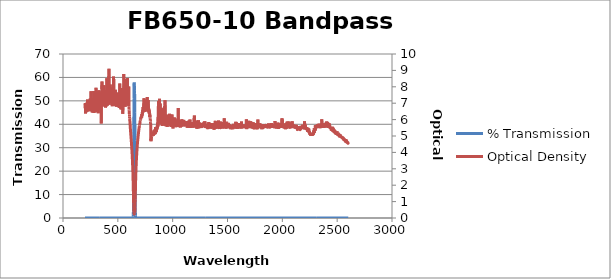
| Category | % Transmission |
|---|---|
| 2600.0 | 0.003 |
| 2599.0 | 0.003 |
| 2598.0 | 0.003 |
| 2597.0 | 0.003 |
| 2596.0 | 0.002 |
| 2595.0 | 0.002 |
| 2594.0 | 0.002 |
| 2593.0 | 0.002 |
| 2592.0 | 0.003 |
| 2591.0 | 0.002 |
| 2590.0 | 0.002 |
| 2589.0 | 0.002 |
| 2588.0 | 0.003 |
| 2587.0 | 0.002 |
| 2586.0 | 0.002 |
| 2585.0 | 0.002 |
| 2584.0 | 0.002 |
| 2583.0 | 0.003 |
| 2582.0 | 0.002 |
| 2581.0 | 0.002 |
| 2580.0 | 0.002 |
| 2579.0 | 0.002 |
| 2578.0 | 0.002 |
| 2577.0 | 0.002 |
| 2576.0 | 0.002 |
| 2575.0 | 0.002 |
| 2574.0 | 0.002 |
| 2573.0 | 0.002 |
| 2572.0 | 0.002 |
| 2571.0 | 0.002 |
| 2570.0 | 0.002 |
| 2569.0 | 0.002 |
| 2568.0 | 0.002 |
| 2567.0 | 0.001 |
| 2566.0 | 0.002 |
| 2565.0 | 0.002 |
| 2564.0 | 0.001 |
| 2563.0 | 0.002 |
| 2562.0 | 0.001 |
| 2561.0 | 0.001 |
| 2560.0 | 0.001 |
| 2559.0 | 0.001 |
| 2558.0 | 0.001 |
| 2557.0 | 0.001 |
| 2556.0 | 0.001 |
| 2555.0 | 0.001 |
| 2554.0 | 0.002 |
| 2553.0 | 0.001 |
| 2552.0 | 0.001 |
| 2551.0 | 0.001 |
| 2550.0 | 0.002 |
| 2549.0 | 0.001 |
| 2548.0 | 0.001 |
| 2547.0 | 0.001 |
| 2546.0 | 0.001 |
| 2545.0 | 0.001 |
| 2544.0 | 0.001 |
| 2543.0 | 0.001 |
| 2542.0 | 0.001 |
| 2541.0 | 0.001 |
| 2540.0 | 0.001 |
| 2539.0 | 0.001 |
| 2538.0 | 0.001 |
| 2537.0 | 0.001 |
| 2536.0 | 0.001 |
| 2535.0 | 0.001 |
| 2534.0 | 0.001 |
| 2533.0 | 0.001 |
| 2532.0 | 0.001 |
| 2531.0 | 0.001 |
| 2530.0 | 0.001 |
| 2529.0 | 0.001 |
| 2528.0 | 0.001 |
| 2527.0 | 0.001 |
| 2526.0 | 0.001 |
| 2525.0 | 0.001 |
| 2524.0 | 0.001 |
| 2523.0 | 0.001 |
| 2522.0 | 0.001 |
| 2521.0 | 0.001 |
| 2520.0 | 0.001 |
| 2519.0 | 0.001 |
| 2518.0 | 0.001 |
| 2517.0 | 0.001 |
| 2516.0 | 0.001 |
| 2515.0 | 0.001 |
| 2514.0 | 0.001 |
| 2513.0 | 0.001 |
| 2512.0 | 0.001 |
| 2511.0 | 0.001 |
| 2510.0 | 0.001 |
| 2509.0 | 0.001 |
| 2508.0 | 0.001 |
| 2507.0 | 0.001 |
| 2506.0 | 0.001 |
| 2505.0 | 0.001 |
| 2504.0 | 0.001 |
| 2503.0 | 0.001 |
| 2502.0 | 0.001 |
| 2501.0 | 0.001 |
| 2500.0 | 0.001 |
| 2499.0 | 0.001 |
| 2498.0 | 0.001 |
| 2497.0 | 0.001 |
| 2496.0 | 0.001 |
| 2495.0 | 0.001 |
| 2494.0 | 0.001 |
| 2493.0 | 0.001 |
| 2492.0 | 0.001 |
| 2491.0 | 0.001 |
| 2490.0 | 0.001 |
| 2489.0 | 0.001 |
| 2488.0 | 0.001 |
| 2487.0 | 0.001 |
| 2486.0 | 0.001 |
| 2485.0 | 0.001 |
| 2484.0 | 0.001 |
| 2483.0 | 0.001 |
| 2482.0 | 0.001 |
| 2481.0 | 0 |
| 2480.0 | 0.001 |
| 2479.0 | 0.001 |
| 2478.0 | 0.001 |
| 2477.0 | 0 |
| 2476.0 | 0 |
| 2475.0 | 0.001 |
| 2474.0 | 0 |
| 2473.0 | 0.001 |
| 2472.0 | 0 |
| 2471.0 | 0.001 |
| 2470.0 | 0.001 |
| 2469.0 | 0 |
| 2468.0 | 0 |
| 2467.0 | 0 |
| 2466.0 | 0.001 |
| 2465.0 | 0 |
| 2464.0 | 0 |
| 2463.0 | 0 |
| 2462.0 | 0 |
| 2461.0 | 0 |
| 2460.0 | 0 |
| 2459.0 | 0.001 |
| 2458.0 | 0 |
| 2457.0 | 0 |
| 2456.0 | 0 |
| 2455.0 | 0 |
| 2454.0 | 0 |
| 2453.0 | 0 |
| 2452.0 | 0 |
| 2451.0 | 0 |
| 2450.0 | 0 |
| 2449.0 | 0 |
| 2448.0 | 0 |
| 2447.0 | 0 |
| 2446.0 | 0 |
| 2445.0 | 0 |
| 2444.0 | 0 |
| 2443.0 | 0 |
| 2442.0 | 0 |
| 2441.0 | 0 |
| 2440.0 | 0 |
| 2439.0 | 0 |
| 2438.0 | 0 |
| 2437.0 | 0 |
| 2436.0 | 0 |
| 2435.0 | 0 |
| 2434.0 | 0 |
| 2433.0 | 0 |
| 2432.0 | 0 |
| 2431.0 | 0 |
| 2430.0 | 0 |
| 2429.0 | 0 |
| 2428.0 | 0 |
| 2427.0 | 0 |
| 2426.0 | 0 |
| 2425.0 | 0 |
| 2424.0 | 0 |
| 2423.0 | 0 |
| 2422.0 | 0 |
| 2421.0 | 0 |
| 2420.0 | 0 |
| 2419.0 | 0 |
| 2418.0 | 0 |
| 2417.0 | 0 |
| 2416.0 | 0 |
| 2415.0 | 0 |
| 2414.0 | 0 |
| 2413.0 | 0 |
| 2412.0 | 0 |
| 2411.0 | 0 |
| 2410.0 | 0 |
| 2409.0 | 0 |
| 2408.0 | 0 |
| 2407.0 | 0 |
| 2406.0 | 0 |
| 2405.0 | 0 |
| 2404.0 | 0 |
| 2403.0 | 0 |
| 2402.0 | 0 |
| 2401.0 | 0 |
| 2400.0 | 0 |
| 2399.0 | 0 |
| 2398.0 | 0 |
| 2397.0 | 0 |
| 2396.0 | 0 |
| 2395.0 | 0 |
| 2394.0 | 0 |
| 2393.0 | 0 |
| 2392.0 | 0 |
| 2391.0 | 0 |
| 2390.0 | 0 |
| 2389.0 | 0 |
| 2388.0 | 0 |
| 2387.0 | 0 |
| 2386.0 | 0 |
| 2385.0 | 0 |
| 2384.0 | 0 |
| 2383.0 | 0 |
| 2382.0 | 0 |
| 2381.0 | 0 |
| 2380.0 | 0 |
| 2379.0 | 0 |
| 2378.0 | 0 |
| 2377.0 | 0 |
| 2376.0 | 0 |
| 2375.0 | 0 |
| 2374.0 | 0 |
| 2373.0 | 0 |
| 2372.0 | 0 |
| 2371.0 | 0 |
| 2370.0 | 0 |
| 2369.0 | 0 |
| 2368.0 | 0 |
| 2367.0 | 0 |
| 2366.0 | 0 |
| 2365.0 | 0 |
| 2364.0 | 0 |
| 2363.0 | 0 |
| 2362.0 | 0 |
| 2361.0 | 0 |
| 2360.0 | 0 |
| 2359.0 | 0 |
| 2358.0 | 0 |
| 2357.0 | 0 |
| 2356.0 | 0 |
| 2355.0 | 0 |
| 2354.0 | 0 |
| 2353.0 | 0 |
| 2352.0 | 0 |
| 2351.0 | 0 |
| 2350.0 | 0 |
| 2349.0 | 0 |
| 2348.0 | 0 |
| 2347.0 | 0 |
| 2346.0 | 0 |
| 2345.0 | 0 |
| 2344.0 | 0 |
| 2343.0 | 0 |
| 2342.0 | 0 |
| 2341.0 | 0 |
| 2340.0 | 0 |
| 2339.0 | 0 |
| 2338.0 | 0 |
| 2337.0 | 0 |
| 2336.0 | 0 |
| 2335.0 | 0 |
| 2334.0 | 0 |
| 2333.0 | 0 |
| 2332.0 | 0 |
| 2331.0 | 0 |
| 2330.0 | 0 |
| 2329.0 | 0 |
| 2328.0 | 0 |
| 2327.0 | 0 |
| 2326.0 | 0 |
| 2325.0 | 0 |
| 2324.0 | 0 |
| 2323.0 | 0 |
| 2322.0 | 0 |
| 2321.0 | 0 |
| 2320.0 | 0 |
| 2319.0 | 0 |
| 2318.0 | 0 |
| 2317.0 | 0 |
| 2316.0 | 0 |
| 2315.0 | 0 |
| 2314.0 | 0 |
| 2313.0 | 0 |
| 2312.0 | 0 |
| 2311.0 | 0 |
| 2310.0 | 0 |
| 2309.0 | 0 |
| 2308.0 | 0 |
| 2307.0 | 0 |
| 2306.0 | 0 |
| 2305.0 | 0 |
| 2304.0 | 0 |
| 2303.0 | 0 |
| 2302.0 | 0 |
| 2301.0 | 0 |
| 2300.0 | 0 |
| 2299.0 | 0 |
| 2298.0 | 0 |
| 2297.0 | 0 |
| 2296.0 | 0 |
| 2295.0 | 0 |
| 2294.0 | 0 |
| 2293.0 | 0 |
| 2292.0 | 0 |
| 2291.0 | 0.001 |
| 2290.0 | 0.001 |
| 2289.0 | 0 |
| 2288.0 | 0.001 |
| 2287.0 | 0.001 |
| 2286.0 | 0 |
| 2285.0 | 0.001 |
| 2284.0 | 0.001 |
| 2283.0 | 0.001 |
| 2282.0 | 0.001 |
| 2281.0 | 0.001 |
| 2280.0 | 0.001 |
| 2279.0 | 0.001 |
| 2278.0 | 0.001 |
| 2277.0 | 0.001 |
| 2276.0 | 0.001 |
| 2275.0 | 0.001 |
| 2274.0 | 0.001 |
| 2273.0 | 0.001 |
| 2272.0 | 0.001 |
| 2271.0 | 0.001 |
| 2270.0 | 0.001 |
| 2269.0 | 0.001 |
| 2268.0 | 0.001 |
| 2267.0 | 0.001 |
| 2266.0 | 0.001 |
| 2265.0 | 0.001 |
| 2264.0 | 0.001 |
| 2263.0 | 0.001 |
| 2262.0 | 0.001 |
| 2261.0 | 0.001 |
| 2260.0 | 0.001 |
| 2259.0 | 0.001 |
| 2258.0 | 0.001 |
| 2257.0 | 0.001 |
| 2256.0 | 0.001 |
| 2255.0 | 0.001 |
| 2254.0 | 0.001 |
| 2253.0 | 0.001 |
| 2252.0 | 0.001 |
| 2251.0 | 0.001 |
| 2250.0 | 0.001 |
| 2249.0 | 0.001 |
| 2248.0 | 0.001 |
| 2247.0 | 0.001 |
| 2246.0 | 0.001 |
| 2245.0 | 0.001 |
| 2244.0 | 0.001 |
| 2243.0 | 0.001 |
| 2242.0 | 0 |
| 2241.0 | 0 |
| 2240.0 | 0.001 |
| 2239.0 | 0 |
| 2238.0 | 0.001 |
| 2237.0 | 0.001 |
| 2236.0 | 0 |
| 2235.0 | 0 |
| 2234.0 | 0 |
| 2233.0 | 0 |
| 2232.0 | 0 |
| 2231.0 | 0.001 |
| 2230.0 | 0 |
| 2229.0 | 0 |
| 2228.0 | 0 |
| 2227.0 | 0 |
| 2226.0 | 0 |
| 2225.0 | 0 |
| 2224.0 | 0 |
| 2223.0 | 0 |
| 2222.0 | 0 |
| 2221.0 | 0 |
| 2220.0 | 0 |
| 2219.0 | 0 |
| 2218.0 | 0 |
| 2217.0 | 0 |
| 2216.0 | 0 |
| 2215.0 | 0 |
| 2214.0 | 0 |
| 2213.0 | 0 |
| 2212.0 | 0 |
| 2211.0 | 0 |
| 2210.0 | 0 |
| 2209.0 | 0 |
| 2208.0 | 0 |
| 2207.0 | 0 |
| 2206.0 | 0 |
| 2205.0 | 0 |
| 2204.0 | 0 |
| 2203.0 | 0 |
| 2202.0 | 0 |
| 2201.0 | 0 |
| 2200.0 | 0 |
| 2199.0 | 0 |
| 2198.0 | 0 |
| 2197.0 | 0 |
| 2196.0 | 0 |
| 2195.0 | 0 |
| 2194.0 | 0 |
| 2193.0 | 0 |
| 2192.0 | 0 |
| 2191.0 | 0 |
| 2190.0 | 0 |
| 2189.0 | 0 |
| 2188.0 | 0 |
| 2187.0 | 0 |
| 2186.0 | 0 |
| 2185.0 | 0 |
| 2184.0 | 0 |
| 2183.0 | 0 |
| 2182.0 | 0 |
| 2181.0 | 0 |
| 2180.0 | 0 |
| 2179.0 | 0 |
| 2178.0 | 0 |
| 2177.0 | 0 |
| 2176.0 | 0 |
| 2175.0 | 0 |
| 2174.0 | 0 |
| 2173.0 | 0 |
| 2172.0 | 0 |
| 2171.0 | 0 |
| 2170.0 | 0 |
| 2169.0 | 0 |
| 2168.0 | 0 |
| 2167.0 | 0 |
| 2166.0 | 0 |
| 2165.0 | 0 |
| 2164.0 | 0 |
| 2163.0 | 0 |
| 2162.0 | 0 |
| 2161.0 | 0 |
| 2160.0 | 0 |
| 2159.0 | 0 |
| 2158.0 | 0 |
| 2157.0 | 0 |
| 2156.0 | 0 |
| 2155.0 | 0 |
| 2154.0 | 0 |
| 2153.0 | 0 |
| 2152.0 | 0 |
| 2151.0 | 0 |
| 2150.0 | 0 |
| 2149.0 | 0 |
| 2148.0 | 0 |
| 2147.0 | 0 |
| 2146.0 | 0 |
| 2145.0 | 0 |
| 2144.0 | 0 |
| 2143.0 | 0 |
| 2142.0 | 0 |
| 2141.0 | 0 |
| 2140.0 | 0 |
| 2139.0 | 0 |
| 2138.0 | 0 |
| 2137.0 | 0 |
| 2136.0 | 0 |
| 2135.0 | 0 |
| 2134.0 | 0 |
| 2133.0 | 0 |
| 2132.0 | 0 |
| 2131.0 | 0 |
| 2130.0 | 0 |
| 2129.0 | 0 |
| 2128.0 | 0 |
| 2127.0 | 0 |
| 2126.0 | 0 |
| 2125.0 | 0 |
| 2124.0 | 0 |
| 2123.0 | 0 |
| 2122.0 | 0 |
| 2121.0 | 0 |
| 2120.0 | 0 |
| 2119.0 | 0 |
| 2118.0 | 0 |
| 2117.0 | 0 |
| 2116.0 | 0 |
| 2115.0 | 0 |
| 2114.0 | 0 |
| 2113.0 | 0 |
| 2112.0 | 0 |
| 2111.0 | 0 |
| 2110.0 | 0 |
| 2109.0 | 0 |
| 2108.0 | 0 |
| 2107.0 | 0 |
| 2106.0 | 0 |
| 2105.0 | 0 |
| 2104.0 | 0 |
| 2103.0 | 0 |
| 2102.0 | 0 |
| 2101.0 | 0 |
| 2100.0 | 0 |
| 2099.0 | 0 |
| 2098.0 | 0 |
| 2097.0 | 0 |
| 2096.0 | 0 |
| 2095.0 | 0 |
| 2094.0 | 0 |
| 2093.0 | 0 |
| 2092.0 | 0 |
| 2091.0 | 0 |
| 2090.0 | 0 |
| 2089.0 | 0 |
| 2088.0 | 0 |
| 2087.0 | 0 |
| 2086.0 | 0 |
| 2085.0 | 0 |
| 2084.0 | 0 |
| 2083.0 | 0 |
| 2082.0 | 0 |
| 2081.0 | 0 |
| 2080.0 | 0 |
| 2079.0 | 0 |
| 2078.0 | 0 |
| 2077.0 | 0 |
| 2076.0 | 0 |
| 2075.0 | 0 |
| 2074.0 | 0 |
| 2073.0 | 0 |
| 2072.0 | 0 |
| 2071.0 | 0 |
| 2070.0 | 0 |
| 2069.0 | 0 |
| 2068.0 | 0 |
| 2067.0 | 0 |
| 2066.0 | 0 |
| 2065.0 | 0 |
| 2064.0 | 0 |
| 2063.0 | 0 |
| 2062.0 | 0 |
| 2061.0 | 0 |
| 2060.0 | 0 |
| 2059.0 | 0 |
| 2058.0 | 0 |
| 2057.0 | 0 |
| 2056.0 | 0 |
| 2055.0 | 0 |
| 2054.0 | 0 |
| 2053.0 | 0 |
| 2052.0 | 0 |
| 2051.0 | 0 |
| 2050.0 | 0 |
| 2049.0 | 0 |
| 2048.0 | 0 |
| 2047.0 | 0 |
| 2046.0 | 0 |
| 2045.0 | 0 |
| 2044.0 | 0 |
| 2043.0 | 0 |
| 2042.0 | 0 |
| 2041.0 | 0 |
| 2040.0 | 0 |
| 2039.0 | 0 |
| 2038.0 | 0 |
| 2037.0 | 0 |
| 2036.0 | 0 |
| 2035.0 | 0 |
| 2034.0 | 0 |
| 2033.0 | 0 |
| 2032.0 | 0 |
| 2031.0 | 0 |
| 2030.0 | 0 |
| 2029.0 | 0 |
| 2028.0 | 0 |
| 2027.0 | 0 |
| 2026.0 | 0 |
| 2025.0 | 0 |
| 2024.0 | 0 |
| 2023.0 | 0 |
| 2022.0 | 0 |
| 2021.0 | 0 |
| 2020.0 | 0 |
| 2019.0 | 0 |
| 2018.0 | 0 |
| 2017.0 | 0 |
| 2016.0 | 0 |
| 2015.0 | 0 |
| 2014.0 | 0 |
| 2013.0 | 0 |
| 2012.0 | 0 |
| 2011.0 | 0 |
| 2010.0 | 0 |
| 2009.0 | 0 |
| 2008.0 | 0 |
| 2007.0 | 0 |
| 2006.0 | 0 |
| 2005.0 | 0 |
| 2004.0 | 0 |
| 2003.0 | 0 |
| 2002.0 | 0 |
| 2001.0 | 0 |
| 2000.0 | 0 |
| 1999.0 | 0 |
| 1998.0 | 0 |
| 1997.0 | 0 |
| 1996.0 | 0 |
| 1995.0 | 0 |
| 1994.0 | 0 |
| 1993.0 | 0 |
| 1992.0 | 0 |
| 1991.0 | 0 |
| 1990.0 | 0 |
| 1989.0 | 0 |
| 1988.0 | 0 |
| 1987.0 | 0 |
| 1986.0 | 0 |
| 1985.0 | 0 |
| 1984.0 | 0 |
| 1983.0 | 0 |
| 1982.0 | 0 |
| 1981.0 | 0 |
| 1980.0 | 0 |
| 1979.0 | 0 |
| 1978.0 | 0 |
| 1977.0 | 0 |
| 1976.0 | 0 |
| 1975.0 | 0 |
| 1974.0 | 0 |
| 1973.0 | 0 |
| 1972.0 | 0 |
| 1971.0 | 0 |
| 1970.0 | 0 |
| 1969.0 | 0 |
| 1968.0 | 0 |
| 1967.0 | 0 |
| 1966.0 | 0 |
| 1965.0 | 0 |
| 1964.0 | 0 |
| 1963.0 | 0 |
| 1962.0 | 0 |
| 1961.0 | 0 |
| 1960.0 | 0 |
| 1959.0 | 0 |
| 1958.0 | 0 |
| 1957.0 | 0 |
| 1956.0 | 0 |
| 1955.0 | 0 |
| 1954.0 | 0 |
| 1953.0 | 0 |
| 1952.0 | 0 |
| 1951.0 | 0 |
| 1950.0 | 0 |
| 1949.0 | 0 |
| 1948.0 | 0 |
| 1947.0 | 0 |
| 1946.0 | 0 |
| 1945.0 | 0 |
| 1944.0 | 0 |
| 1943.0 | 0 |
| 1942.0 | 0 |
| 1941.0 | 0 |
| 1940.0 | 0 |
| 1939.0 | 0 |
| 1938.0 | 0 |
| 1937.0 | 0 |
| 1936.0 | 0 |
| 1935.0 | 0 |
| 1934.0 | 0 |
| 1933.0 | 0 |
| 1932.0 | 0 |
| 1931.0 | 0 |
| 1930.0 | 0 |
| 1929.0 | 0 |
| 1928.0 | 0 |
| 1927.0 | 0 |
| 1926.0 | 0 |
| 1925.0 | 0 |
| 1924.0 | 0 |
| 1923.0 | 0 |
| 1922.0 | 0 |
| 1921.0 | 0 |
| 1920.0 | 0 |
| 1919.0 | 0 |
| 1918.0 | 0 |
| 1917.0 | 0 |
| 1916.0 | 0 |
| 1915.0 | 0 |
| 1914.0 | 0 |
| 1913.0 | 0 |
| 1912.0 | 0 |
| 1911.0 | 0 |
| 1910.0 | 0 |
| 1909.0 | 0 |
| 1908.0 | 0 |
| 1907.0 | 0 |
| 1906.0 | 0 |
| 1905.0 | 0 |
| 1904.0 | 0 |
| 1903.0 | 0 |
| 1902.0 | 0 |
| 1901.0 | 0 |
| 1900.0 | 0 |
| 1899.0 | 0 |
| 1898.0 | 0 |
| 1897.0 | 0 |
| 1896.0 | 0 |
| 1895.0 | 0 |
| 1894.0 | 0 |
| 1893.0 | 0 |
| 1892.0 | 0 |
| 1891.0 | 0 |
| 1890.0 | 0 |
| 1889.0 | 0 |
| 1888.0 | 0 |
| 1887.0 | 0 |
| 1886.0 | 0 |
| 1885.0 | 0 |
| 1884.0 | 0 |
| 1883.0 | 0 |
| 1882.0 | 0 |
| 1881.0 | 0 |
| 1880.0 | 0 |
| 1879.0 | 0 |
| 1878.0 | 0 |
| 1877.0 | 0 |
| 1876.0 | 0 |
| 1875.0 | 0 |
| 1874.0 | 0 |
| 1873.0 | 0 |
| 1872.0 | 0 |
| 1871.0 | 0 |
| 1870.0 | 0 |
| 1869.0 | 0 |
| 1868.0 | 0 |
| 1867.0 | 0 |
| 1866.0 | 0 |
| 1865.0 | 0 |
| 1864.0 | 0 |
| 1863.0 | 0 |
| 1862.0 | 0 |
| 1861.0 | 0 |
| 1860.0 | 0 |
| 1859.0 | 0 |
| 1858.0 | 0 |
| 1857.0 | 0 |
| 1856.0 | 0 |
| 1855.0 | 0 |
| 1854.0 | 0 |
| 1853.0 | 0 |
| 1852.0 | 0 |
| 1851.0 | 0 |
| 1850.0 | 0 |
| 1849.0 | 0 |
| 1848.0 | 0 |
| 1847.0 | 0 |
| 1846.0 | 0 |
| 1845.0 | 0 |
| 1844.0 | 0 |
| 1843.0 | 0 |
| 1842.0 | 0 |
| 1841.0 | 0 |
| 1840.0 | 0 |
| 1839.0 | 0 |
| 1838.0 | 0 |
| 1837.0 | 0 |
| 1836.0 | 0 |
| 1835.0 | 0 |
| 1834.0 | 0 |
| 1833.0 | 0 |
| 1832.0 | 0 |
| 1831.0 | 0 |
| 1830.0 | 0 |
| 1829.0 | 0 |
| 1828.0 | 0 |
| 1827.0 | 0 |
| 1826.0 | 0 |
| 1825.0 | 0 |
| 1824.0 | 0 |
| 1823.0 | 0 |
| 1822.0 | 0 |
| 1821.0 | 0 |
| 1820.0 | 0 |
| 1819.0 | 0 |
| 1818.0 | 0 |
| 1817.0 | 0 |
| 1816.0 | 0 |
| 1815.0 | 0 |
| 1814.0 | 0 |
| 1813.0 | 0 |
| 1812.0 | 0 |
| 1811.0 | 0 |
| 1810.0 | 0 |
| 1809.0 | 0 |
| 1808.0 | 0 |
| 1807.0 | 0 |
| 1806.0 | 0 |
| 1805.0 | 0 |
| 1804.0 | 0 |
| 1803.0 | 0 |
| 1802.0 | 0 |
| 1801.0 | 0 |
| 1800.0 | 0 |
| 1799.0 | 0 |
| 1798.0 | 0 |
| 1797.0 | 0 |
| 1796.0 | 0 |
| 1795.0 | 0 |
| 1794.0 | 0 |
| 1793.0 | 0 |
| 1792.0 | 0 |
| 1791.0 | 0 |
| 1790.0 | 0 |
| 1789.0 | 0 |
| 1788.0 | 0 |
| 1787.0 | 0 |
| 1786.0 | 0 |
| 1785.0 | 0 |
| 1784.0 | 0 |
| 1783.0 | 0 |
| 1782.0 | 0 |
| 1781.0 | 0 |
| 1780.0 | 0 |
| 1779.0 | 0 |
| 1778.0 | 0 |
| 1777.0 | 0 |
| 1776.0 | 0 |
| 1775.0 | 0 |
| 1774.0 | 0 |
| 1773.0 | 0 |
| 1772.0 | 0 |
| 1771.0 | 0 |
| 1770.0 | 0 |
| 1769.0 | 0 |
| 1768.0 | 0 |
| 1767.0 | 0 |
| 1766.0 | 0 |
| 1765.0 | 0 |
| 1764.0 | 0 |
| 1763.0 | 0 |
| 1762.0 | 0 |
| 1761.0 | 0 |
| 1760.0 | 0 |
| 1759.0 | 0 |
| 1758.0 | 0 |
| 1757.0 | 0 |
| 1756.0 | 0 |
| 1755.0 | 0 |
| 1754.0 | 0 |
| 1753.0 | 0 |
| 1752.0 | 0 |
| 1751.0 | 0 |
| 1750.0 | 0 |
| 1749.0 | 0 |
| 1748.0 | 0 |
| 1747.0 | 0 |
| 1746.0 | 0 |
| 1745.0 | 0 |
| 1744.0 | 0 |
| 1743.0 | 0 |
| 1742.0 | 0 |
| 1741.0 | 0 |
| 1740.0 | 0 |
| 1739.0 | 0 |
| 1738.0 | 0 |
| 1737.0 | 0 |
| 1736.0 | 0 |
| 1735.0 | 0 |
| 1734.0 | 0 |
| 1733.0 | 0 |
| 1732.0 | 0 |
| 1731.0 | 0 |
| 1730.0 | 0 |
| 1729.0 | 0 |
| 1728.0 | 0 |
| 1727.0 | 0 |
| 1726.0 | 0 |
| 1725.0 | 0 |
| 1724.0 | 0 |
| 1723.0 | 0 |
| 1722.0 | 0 |
| 1721.0 | 0 |
| 1720.0 | 0 |
| 1719.0 | 0 |
| 1718.0 | 0 |
| 1717.0 | 0 |
| 1716.0 | 0 |
| 1715.0 | 0 |
| 1714.0 | 0 |
| 1713.0 | 0 |
| 1712.0 | 0 |
| 1711.0 | 0 |
| 1710.0 | 0 |
| 1709.0 | 0 |
| 1708.0 | 0 |
| 1707.0 | 0 |
| 1706.0 | 0 |
| 1705.0 | 0 |
| 1704.0 | 0 |
| 1703.0 | 0 |
| 1702.0 | 0 |
| 1701.0 | 0 |
| 1700.0 | 0 |
| 1699.0 | 0 |
| 1698.0 | 0 |
| 1697.0 | 0 |
| 1696.0 | 0 |
| 1695.0 | 0 |
| 1694.0 | 0 |
| 1693.0 | 0 |
| 1692.0 | 0 |
| 1691.0 | 0 |
| 1690.0 | 0 |
| 1689.0 | 0 |
| 1688.0 | 0 |
| 1687.0 | 0 |
| 1686.0 | 0 |
| 1685.0 | 0 |
| 1684.0 | 0 |
| 1683.0 | 0 |
| 1682.0 | 0 |
| 1681.0 | 0 |
| 1680.0 | 0 |
| 1679.0 | 0 |
| 1678.0 | 0 |
| 1677.0 | 0 |
| 1676.0 | 0 |
| 1675.0 | 0 |
| 1674.0 | 0 |
| 1673.0 | 0 |
| 1672.0 | 0 |
| 1671.0 | 0 |
| 1670.0 | 0 |
| 1669.0 | 0 |
| 1668.0 | 0 |
| 1667.0 | 0 |
| 1666.0 | 0 |
| 1665.0 | 0 |
| 1664.0 | 0 |
| 1663.0 | 0 |
| 1662.0 | 0 |
| 1661.0 | 0 |
| 1660.0 | 0 |
| 1659.0 | 0 |
| 1658.0 | 0 |
| 1657.0 | 0 |
| 1656.0 | 0 |
| 1655.0 | 0 |
| 1654.0 | 0 |
| 1653.0 | 0 |
| 1652.0 | 0 |
| 1651.0 | 0 |
| 1650.0 | 0 |
| 1649.0 | 0 |
| 1648.0 | 0 |
| 1647.0 | 0 |
| 1646.0 | 0 |
| 1645.0 | 0 |
| 1644.0 | 0 |
| 1643.0 | 0 |
| 1642.0 | 0 |
| 1641.0 | 0 |
| 1640.0 | 0 |
| 1639.0 | 0 |
| 1638.0 | 0 |
| 1637.0 | 0 |
| 1636.0 | 0 |
| 1635.0 | 0 |
| 1634.0 | 0 |
| 1633.0 | 0 |
| 1632.0 | 0 |
| 1631.0 | 0 |
| 1630.0 | 0 |
| 1629.0 | 0 |
| 1628.0 | 0 |
| 1627.0 | 0 |
| 1626.0 | 0 |
| 1625.0 | 0 |
| 1624.0 | 0 |
| 1623.0 | 0 |
| 1622.0 | 0 |
| 1621.0 | 0 |
| 1620.0 | 0 |
| 1619.0 | 0 |
| 1618.0 | 0 |
| 1617.0 | 0 |
| 1616.0 | 0 |
| 1615.0 | 0 |
| 1614.0 | 0 |
| 1613.0 | 0 |
| 1612.0 | 0 |
| 1611.0 | 0 |
| 1610.0 | 0 |
| 1609.0 | 0 |
| 1608.0 | 0 |
| 1607.0 | 0 |
| 1606.0 | 0 |
| 1605.0 | 0 |
| 1604.0 | 0 |
| 1603.0 | 0 |
| 1602.0 | 0 |
| 1601.0 | 0 |
| 1600.0 | 0 |
| 1599.0 | 0 |
| 1598.0 | 0 |
| 1597.0 | 0 |
| 1596.0 | 0 |
| 1595.0 | 0 |
| 1594.0 | 0 |
| 1593.0 | 0 |
| 1592.0 | 0 |
| 1591.0 | 0 |
| 1590.0 | 0 |
| 1589.0 | 0 |
| 1588.0 | 0 |
| 1587.0 | 0 |
| 1586.0 | 0 |
| 1585.0 | 0 |
| 1584.0 | 0 |
| 1583.0 | 0 |
| 1582.0 | 0 |
| 1581.0 | 0 |
| 1580.0 | 0 |
| 1579.0 | 0 |
| 1578.0 | 0 |
| 1577.0 | 0 |
| 1576.0 | 0 |
| 1575.0 | 0 |
| 1574.0 | 0 |
| 1573.0 | 0 |
| 1572.0 | 0 |
| 1571.0 | 0 |
| 1570.0 | 0 |
| 1569.0 | 0 |
| 1568.0 | 0 |
| 1567.0 | 0 |
| 1566.0 | 0 |
| 1565.0 | 0 |
| 1564.0 | 0 |
| 1563.0 | 0 |
| 1562.0 | 0 |
| 1561.0 | 0 |
| 1560.0 | 0 |
| 1559.0 | 0 |
| 1558.0 | 0 |
| 1557.0 | 0 |
| 1556.0 | 0 |
| 1555.0 | 0 |
| 1554.0 | 0 |
| 1553.0 | 0 |
| 1552.0 | 0 |
| 1551.0 | 0 |
| 1550.0 | 0 |
| 1549.0 | 0 |
| 1548.0 | 0 |
| 1547.0 | 0 |
| 1546.0 | 0 |
| 1545.0 | 0 |
| 1544.0 | 0 |
| 1543.0 | 0 |
| 1542.0 | 0 |
| 1541.0 | 0 |
| 1540.0 | 0 |
| 1539.0 | 0 |
| 1538.0 | 0 |
| 1537.0 | 0 |
| 1536.0 | 0 |
| 1535.0 | 0 |
| 1534.0 | 0 |
| 1533.0 | 0 |
| 1532.0 | 0 |
| 1531.0 | 0 |
| 1530.0 | 0 |
| 1529.0 | 0 |
| 1528.0 | 0 |
| 1527.0 | 0 |
| 1526.0 | 0 |
| 1525.0 | 0 |
| 1524.0 | 0 |
| 1523.0 | 0 |
| 1522.0 | 0 |
| 1521.0 | 0 |
| 1520.0 | 0 |
| 1519.0 | 0 |
| 1518.0 | 0 |
| 1517.0 | 0 |
| 1516.0 | 0 |
| 1515.0 | 0 |
| 1514.0 | 0 |
| 1513.0 | 0 |
| 1512.0 | 0 |
| 1511.0 | 0 |
| 1510.0 | 0 |
| 1509.0 | 0 |
| 1508.0 | 0 |
| 1507.0 | 0 |
| 1506.0 | 0 |
| 1505.0 | 0 |
| 1504.0 | 0 |
| 1503.0 | 0 |
| 1502.0 | 0 |
| 1501.0 | 0 |
| 1500.0 | 0 |
| 1499.0 | 0 |
| 1498.0 | 0 |
| 1497.0 | 0 |
| 1496.0 | 0 |
| 1495.0 | 0 |
| 1494.0 | 0 |
| 1493.0 | 0 |
| 1492.0 | 0 |
| 1491.0 | 0 |
| 1490.0 | 0 |
| 1489.0 | 0 |
| 1488.0 | 0 |
| 1487.0 | 0 |
| 1486.0 | 0 |
| 1485.0 | 0 |
| 1484.0 | 0 |
| 1483.0 | 0 |
| 1482.0 | 0 |
| 1481.0 | 0 |
| 1480.0 | 0 |
| 1479.0 | 0 |
| 1478.0 | 0 |
| 1477.0 | 0 |
| 1476.0 | 0 |
| 1475.0 | 0 |
| 1474.0 | 0 |
| 1473.0 | 0 |
| 1472.0 | 0 |
| 1471.0 | 0 |
| 1470.0 | 0 |
| 1469.0 | 0 |
| 1468.0 | 0 |
| 1467.0 | 0 |
| 1466.0 | 0 |
| 1465.0 | 0 |
| 1464.0 | 0 |
| 1463.0 | 0 |
| 1462.0 | 0 |
| 1461.0 | 0 |
| 1460.0 | 0 |
| 1459.0 | 0 |
| 1458.0 | 0 |
| 1457.0 | 0 |
| 1456.0 | 0 |
| 1455.0 | 0 |
| 1454.0 | 0 |
| 1453.0 | 0 |
| 1452.0 | 0 |
| 1451.0 | 0 |
| 1450.0 | 0 |
| 1449.0 | 0 |
| 1448.0 | 0 |
| 1447.0 | 0 |
| 1446.0 | 0 |
| 1445.0 | 0 |
| 1444.0 | 0 |
| 1443.0 | 0 |
| 1442.0 | 0 |
| 1441.0 | 0 |
| 1440.0 | 0 |
| 1439.0 | 0 |
| 1438.0 | 0 |
| 1437.0 | 0 |
| 1436.0 | 0 |
| 1435.0 | 0 |
| 1434.0 | 0 |
| 1433.0 | 0 |
| 1432.0 | 0 |
| 1431.0 | 0 |
| 1430.0 | 0 |
| 1429.0 | 0 |
| 1428.0 | 0 |
| 1427.0 | 0 |
| 1426.0 | 0 |
| 1425.0 | 0 |
| 1424.0 | 0 |
| 1423.0 | 0 |
| 1422.0 | 0 |
| 1421.0 | 0 |
| 1420.0 | 0 |
| 1419.0 | 0 |
| 1418.0 | 0 |
| 1417.0 | 0 |
| 1416.0 | 0 |
| 1415.0 | 0 |
| 1414.0 | 0 |
| 1413.0 | 0 |
| 1412.0 | 0 |
| 1411.0 | 0 |
| 1410.0 | 0 |
| 1409.0 | 0 |
| 1408.0 | 0 |
| 1407.0 | 0 |
| 1406.0 | 0 |
| 1405.0 | 0 |
| 1404.0 | 0 |
| 1403.0 | 0 |
| 1402.0 | 0 |
| 1401.0 | 0 |
| 1400.0 | 0 |
| 1399.0 | 0 |
| 1398.0 | 0 |
| 1397.0 | 0 |
| 1396.0 | 0 |
| 1395.0 | 0 |
| 1394.0 | 0 |
| 1393.0 | 0 |
| 1392.0 | 0 |
| 1391.0 | 0 |
| 1390.0 | 0 |
| 1389.0 | 0 |
| 1388.0 | 0 |
| 1387.0 | 0 |
| 1386.0 | 0 |
| 1385.0 | 0 |
| 1384.0 | 0 |
| 1383.0 | 0 |
| 1382.0 | 0 |
| 1381.0 | 0 |
| 1380.0 | 0 |
| 1379.0 | 0 |
| 1378.0 | 0 |
| 1377.0 | 0 |
| 1376.0 | 0 |
| 1375.0 | 0 |
| 1374.0 | 0 |
| 1373.0 | 0 |
| 1372.0 | 0 |
| 1371.0 | 0 |
| 1370.0 | 0 |
| 1369.0 | 0 |
| 1368.0 | 0 |
| 1367.0 | 0 |
| 1366.0 | 0 |
| 1365.0 | 0 |
| 1364.0 | 0 |
| 1363.0 | 0 |
| 1362.0 | 0 |
| 1361.0 | 0 |
| 1360.0 | 0 |
| 1359.0 | 0 |
| 1358.0 | 0 |
| 1357.0 | 0 |
| 1356.0 | 0 |
| 1355.0 | 0 |
| 1354.0 | 0 |
| 1353.0 | 0 |
| 1352.0 | 0 |
| 1351.0 | 0 |
| 1350.0 | 0 |
| 1349.0 | 0 |
| 1348.0 | 0 |
| 1347.0 | 0 |
| 1346.0 | 0 |
| 1345.0 | 0 |
| 1344.0 | 0 |
| 1343.0 | 0 |
| 1342.0 | 0 |
| 1341.0 | 0 |
| 1340.0 | 0 |
| 1339.0 | 0 |
| 1338.0 | 0 |
| 1337.0 | 0 |
| 1336.0 | 0 |
| 1335.0 | 0 |
| 1334.0 | 0 |
| 1333.0 | 0 |
| 1332.0 | 0 |
| 1331.0 | 0 |
| 1330.0 | 0 |
| 1329.0 | 0 |
| 1328.0 | 0 |
| 1327.0 | 0 |
| 1326.0 | 0 |
| 1325.0 | 0 |
| 1324.0 | 0 |
| 1323.0 | 0 |
| 1322.0 | 0 |
| 1321.0 | 0 |
| 1320.0 | 0 |
| 1319.0 | 0 |
| 1318.0 | 0 |
| 1317.0 | 0 |
| 1316.0 | 0 |
| 1315.0 | 0 |
| 1314.0 | 0 |
| 1313.0 | 0 |
| 1312.0 | 0 |
| 1311.0 | 0 |
| 1310.0 | 0 |
| 1309.0 | 0 |
| 1308.0 | 0 |
| 1307.0 | 0 |
| 1306.0 | 0 |
| 1305.0 | 0 |
| 1304.0 | 0 |
| 1303.0 | 0 |
| 1302.0 | 0 |
| 1301.0 | 0 |
| 1300.0 | 0 |
| 1299.0 | 0 |
| 1298.0 | 0 |
| 1297.0 | 0 |
| 1296.0 | 0 |
| 1295.0 | 0 |
| 1294.0 | 0 |
| 1293.0 | 0 |
| 1292.0 | 0 |
| 1291.0 | 0 |
| 1290.0 | 0 |
| 1289.0 | 0 |
| 1288.0 | 0 |
| 1287.0 | 0 |
| 1286.0 | 0 |
| 1285.0 | 0 |
| 1284.0 | 0 |
| 1283.0 | 0 |
| 1282.0 | 0 |
| 1281.0 | 0 |
| 1280.0 | 0 |
| 1279.0 | 0 |
| 1278.0 | 0 |
| 1277.0 | 0 |
| 1276.0 | 0 |
| 1275.0 | 0 |
| 1274.0 | 0 |
| 1273.0 | 0 |
| 1272.0 | 0 |
| 1271.0 | 0 |
| 1270.0 | 0 |
| 1269.0 | 0 |
| 1268.0 | 0 |
| 1267.0 | 0 |
| 1266.0 | 0 |
| 1265.0 | 0 |
| 1264.0 | 0 |
| 1263.0 | 0 |
| 1262.0 | 0 |
| 1261.0 | 0 |
| 1260.0 | 0 |
| 1259.0 | 0 |
| 1258.0 | 0 |
| 1257.0 | 0 |
| 1256.0 | 0 |
| 1255.0 | 0 |
| 1254.0 | 0 |
| 1253.0 | 0 |
| 1252.0 | 0 |
| 1251.0 | 0 |
| 1250.0 | 0 |
| 1249.0 | 0 |
| 1248.0 | 0 |
| 1247.0 | 0 |
| 1246.0 | 0 |
| 1245.0 | 0 |
| 1244.0 | 0 |
| 1243.0 | 0 |
| 1242.0 | 0 |
| 1241.0 | 0 |
| 1240.0 | 0 |
| 1239.0 | 0 |
| 1238.0 | 0 |
| 1237.0 | 0 |
| 1236.0 | 0 |
| 1235.0 | 0 |
| 1234.0 | 0 |
| 1233.0 | 0 |
| 1232.0 | 0 |
| 1231.0 | 0 |
| 1230.0 | 0 |
| 1229.0 | 0 |
| 1228.0 | 0 |
| 1227.0 | 0 |
| 1226.0 | 0 |
| 1225.0 | 0 |
| 1224.0 | 0 |
| 1223.0 | 0 |
| 1222.0 | 0 |
| 1221.0 | 0 |
| 1220.0 | 0 |
| 1219.0 | 0 |
| 1218.0 | 0 |
| 1217.0 | 0 |
| 1216.0 | 0 |
| 1215.0 | 0 |
| 1214.0 | 0 |
| 1213.0 | 0 |
| 1212.0 | 0 |
| 1211.0 | 0 |
| 1210.0 | 0 |
| 1209.0 | 0 |
| 1208.0 | 0 |
| 1207.0 | 0 |
| 1206.0 | 0 |
| 1205.0 | 0 |
| 1204.0 | 0 |
| 1203.0 | 0 |
| 1202.0 | 0 |
| 1201.0 | 0 |
| 1200.0 | 0 |
| 1199.0 | 0 |
| 1198.0 | 0 |
| 1197.0 | 0 |
| 1196.0 | 0 |
| 1195.0 | 0 |
| 1194.0 | 0 |
| 1193.0 | 0 |
| 1192.0 | 0 |
| 1191.0 | 0 |
| 1190.0 | 0 |
| 1189.0 | 0 |
| 1188.0 | 0 |
| 1187.0 | 0 |
| 1186.0 | 0 |
| 1185.0 | 0 |
| 1184.0 | 0 |
| 1183.0 | 0 |
| 1182.0 | 0 |
| 1181.0 | 0 |
| 1180.0 | 0 |
| 1179.0 | 0 |
| 1178.0 | 0 |
| 1177.0 | 0 |
| 1176.0 | 0 |
| 1175.0 | 0 |
| 1174.0 | 0 |
| 1173.0 | 0 |
| 1172.0 | 0 |
| 1171.0 | 0 |
| 1170.0 | 0 |
| 1169.0 | 0 |
| 1168.0 | 0 |
| 1167.0 | 0 |
| 1166.0 | 0 |
| 1165.0 | 0 |
| 1164.0 | 0 |
| 1163.0 | 0 |
| 1162.0 | 0 |
| 1161.0 | 0 |
| 1160.0 | 0 |
| 1159.0 | 0 |
| 1158.0 | 0 |
| 1157.0 | 0 |
| 1156.0 | 0 |
| 1155.0 | 0 |
| 1154.0 | 0 |
| 1153.0 | 0 |
| 1152.0 | 0 |
| 1151.0 | 0 |
| 1150.0 | 0 |
| 1149.0 | 0 |
| 1148.0 | 0 |
| 1147.0 | 0 |
| 1146.0 | 0 |
| 1145.0 | 0 |
| 1144.0 | 0 |
| 1143.0 | 0 |
| 1142.0 | 0 |
| 1141.0 | 0 |
| 1140.0 | 0 |
| 1139.0 | 0 |
| 1138.0 | 0 |
| 1137.0 | 0 |
| 1136.0 | 0 |
| 1135.0 | 0 |
| 1134.0 | 0 |
| 1133.0 | 0 |
| 1132.0 | 0 |
| 1131.0 | 0 |
| 1130.0 | 0 |
| 1129.0 | 0 |
| 1128.0 | 0 |
| 1127.0 | 0 |
| 1126.0 | 0 |
| 1125.0 | 0 |
| 1124.0 | 0 |
| 1123.0 | 0 |
| 1122.0 | 0 |
| 1121.0 | 0 |
| 1120.0 | 0 |
| 1119.0 | 0 |
| 1118.0 | 0 |
| 1117.0 | 0 |
| 1116.0 | 0 |
| 1115.0 | 0 |
| 1114.0 | 0 |
| 1113.0 | 0 |
| 1112.0 | 0 |
| 1111.0 | 0 |
| 1110.0 | 0 |
| 1109.0 | 0 |
| 1108.0 | 0 |
| 1107.0 | 0 |
| 1106.0 | 0 |
| 1105.0 | 0 |
| 1104.0 | 0 |
| 1103.0 | 0 |
| 1102.0 | 0 |
| 1101.0 | 0 |
| 1100.0 | 0 |
| 1099.0 | 0 |
| 1098.0 | 0 |
| 1097.0 | 0 |
| 1096.0 | 0 |
| 1095.0 | 0 |
| 1094.0 | 0 |
| 1093.0 | 0 |
| 1092.0 | 0 |
| 1091.0 | 0 |
| 1090.0 | 0 |
| 1089.0 | 0 |
| 1088.0 | 0 |
| 1087.0 | 0 |
| 1086.0 | 0 |
| 1085.0 | 0 |
| 1084.0 | 0 |
| 1083.0 | 0 |
| 1082.0 | 0 |
| 1081.0 | 0 |
| 1080.0 | 0 |
| 1079.0 | 0 |
| 1078.0 | 0 |
| 1077.0 | 0 |
| 1076.0 | 0 |
| 1075.0 | 0 |
| 1074.0 | 0 |
| 1073.0 | 0 |
| 1072.0 | 0 |
| 1071.0 | 0 |
| 1070.0 | 0 |
| 1069.0 | 0 |
| 1068.0 | 0 |
| 1067.0 | 0 |
| 1066.0 | 0 |
| 1065.0 | 0 |
| 1064.0 | 0 |
| 1063.0 | 0 |
| 1062.0 | 0 |
| 1061.0 | 0 |
| 1060.0 | 0 |
| 1059.0 | 0 |
| 1058.0 | 0 |
| 1057.0 | 0 |
| 1056.0 | 0 |
| 1055.0 | 0 |
| 1054.0 | 0 |
| 1053.0 | 0 |
| 1052.0 | 0 |
| 1051.0 | 0 |
| 1050.0 | 0 |
| 1049.0 | 0 |
| 1048.0 | 0 |
| 1047.0 | 0 |
| 1046.0 | 0 |
| 1045.0 | 0 |
| 1044.0 | 0 |
| 1043.0 | 0 |
| 1042.0 | 0 |
| 1041.0 | 0 |
| 1040.0 | 0 |
| 1039.0 | 0 |
| 1038.0 | 0 |
| 1037.0 | 0 |
| 1036.0 | 0 |
| 1035.0 | 0 |
| 1034.0 | 0 |
| 1033.0 | 0 |
| 1032.0 | 0 |
| 1031.0 | 0 |
| 1030.0 | 0 |
| 1029.0 | 0 |
| 1028.0 | 0 |
| 1027.0 | 0 |
| 1026.0 | 0 |
| 1025.0 | 0 |
| 1024.0 | 0 |
| 1023.0 | 0 |
| 1022.0 | 0 |
| 1021.0 | 0 |
| 1020.0 | 0 |
| 1019.0 | 0 |
| 1018.0 | 0 |
| 1017.0 | 0 |
| 1016.0 | 0 |
| 1015.0 | 0 |
| 1014.0 | 0 |
| 1013.0 | 0 |
| 1012.0 | 0 |
| 1011.0 | 0 |
| 1010.0 | 0 |
| 1009.0 | 0 |
| 1008.0 | 0 |
| 1007.0 | 0 |
| 1006.0 | 0 |
| 1005.0 | 0 |
| 1004.0 | 0 |
| 1003.0 | 0 |
| 1002.0 | 0 |
| 1001.0 | 0 |
| 1000.0 | 0 |
| 999.0 | 0 |
| 998.0 | 0 |
| 997.0 | 0 |
| 996.0 | 0 |
| 995.0 | 0 |
| 994.0 | 0 |
| 993.0 | 0 |
| 992.0 | 0 |
| 991.0 | 0 |
| 990.0 | 0 |
| 989.0 | 0 |
| 988.0 | 0 |
| 987.0 | 0 |
| 986.0 | 0 |
| 985.0 | 0 |
| 984.0 | 0 |
| 983.0 | 0 |
| 982.0 | 0 |
| 981.0 | 0 |
| 980.0 | 0 |
| 979.0 | 0 |
| 978.0 | 0 |
| 977.0 | 0 |
| 976.0 | 0 |
| 975.0 | 0 |
| 974.0 | 0 |
| 973.0 | 0 |
| 972.0 | 0 |
| 971.0 | 0 |
| 970.0 | 0 |
| 969.0 | 0 |
| 968.0 | 0 |
| 967.0 | 0 |
| 966.0 | 0 |
| 965.0 | 0 |
| 964.0 | 0 |
| 963.0 | 0 |
| 962.0 | 0 |
| 961.0 | 0 |
| 960.0 | 0 |
| 959.0 | 0 |
| 958.0 | 0 |
| 957.0 | 0 |
| 956.0 | 0 |
| 955.0 | 0 |
| 954.0 | 0 |
| 953.0 | 0 |
| 952.0 | 0 |
| 951.0 | 0 |
| 950.0 | 0 |
| 949.0 | 0 |
| 948.0 | 0 |
| 947.0 | 0 |
| 946.0 | 0 |
| 945.0 | 0 |
| 944.0 | 0 |
| 943.0 | 0 |
| 942.0 | 0 |
| 941.0 | 0 |
| 940.0 | 0 |
| 939.0 | 0 |
| 938.0 | 0 |
| 937.0 | 0 |
| 936.0 | 0 |
| 935.0 | 0 |
| 934.0 | 0 |
| 933.0 | 0 |
| 932.0 | 0 |
| 931.0 | 0 |
| 930.0 | 0 |
| 929.0 | 0 |
| 928.0 | 0 |
| 927.0 | 0 |
| 926.0 | 0 |
| 925.0 | 0 |
| 924.0 | 0 |
| 923.0 | 0 |
| 922.0 | 0 |
| 921.0 | 0 |
| 920.0 | 0 |
| 919.0 | 0 |
| 918.0 | 0 |
| 917.0 | 0 |
| 916.0 | 0 |
| 915.0 | 0 |
| 914.0 | 0 |
| 913.0 | 0 |
| 912.0 | 0 |
| 911.0 | 0 |
| 910.0 | 0 |
| 909.0 | 0 |
| 908.0 | 0 |
| 907.0 | 0 |
| 906.0 | 0 |
| 905.0 | 0 |
| 904.0 | 0 |
| 903.0 | 0 |
| 902.0 | 0 |
| 901.0 | 0 |
| 900.0 | 0 |
| 899.0 | 0 |
| 898.0 | 0 |
| 897.0 | 0 |
| 896.0 | 0 |
| 895.0 | 0 |
| 894.0 | 0 |
| 893.0 | 0 |
| 892.0 | 0 |
| 891.0 | 0 |
| 890.0 | 0 |
| 889.0 | 0 |
| 888.0 | 0 |
| 887.0 | 0 |
| 886.0 | 0 |
| 885.0 | 0 |
| 884.0 | 0 |
| 883.0 | 0 |
| 882.0 | 0 |
| 881.0 | 0 |
| 880.0 | 0 |
| 879.0 | 0 |
| 878.0 | 0 |
| 877.0 | 0 |
| 876.0 | 0 |
| 875.0 | 0 |
| 874.0 | 0 |
| 873.0 | 0 |
| 872.0 | 0 |
| 871.0 | 0 |
| 870.0 | 0 |
| 869.0 | 0 |
| 868.0 | 0 |
| 867.0 | 0 |
| 866.0 | 0 |
| 865.0 | 0 |
| 864.0 | 0 |
| 863.0 | 0 |
| 862.0 | 0 |
| 861.0 | 0 |
| 860.0 | 0 |
| 859.0 | 0 |
| 858.0 | 0 |
| 857.0 | 0 |
| 856.0 | 0 |
| 855.0 | 0 |
| 854.0 | 0 |
| 853.0 | 0 |
| 852.0 | 0 |
| 851.0 | 0.001 |
| 850.0 | 0 |
| 849.0 | 0.001 |
| 848.0 | 0 |
| 847.0 | 0 |
| 846.0 | 0 |
| 845.0 | 0.001 |
| 844.0 | 0 |
| 843.0 | 0.001 |
| 842.0 | 0.001 |
| 841.0 | 0.001 |
| 840.0 | 0.001 |
| 839.0 | 0 |
| 838.0 | 0 |
| 837.0 | 0.001 |
| 836.0 | 0.001 |
| 835.0 | 0.001 |
| 834.0 | 0.001 |
| 833.0 | 0.001 |
| 832.0 | 0.001 |
| 831.0 | 0.001 |
| 830.0 | 0.001 |
| 829.0 | 0 |
| 828.0 | 0.001 |
| 827.0 | 0.001 |
| 826.0 | 0.001 |
| 825.0 | 0.001 |
| 824.0 | 0.001 |
| 823.0 | 0.001 |
| 822.0 | 0.001 |
| 821.0 | 0.001 |
| 820.0 | 0.001 |
| 819.0 | 0.001 |
| 818.0 | 0.001 |
| 817.0 | 0.001 |
| 816.0 | 0.001 |
| 815.0 | 0.001 |
| 814.0 | 0.001 |
| 813.0 | 0.001 |
| 812.0 | 0.001 |
| 811.0 | 0.001 |
| 810.0 | 0.001 |
| 809.0 | 0.001 |
| 808.0 | 0.001 |
| 807.0 | 0.001 |
| 806.0 | 0.001 |
| 805.0 | 0.001 |
| 804.0 | 0.002 |
| 803.0 | 0.002 |
| 802.0 | 0.002 |
| 801.0 | 0.002 |
| 800.0 | 0.002 |
| 799.0 | 0 |
| 798.0 | 0 |
| 797.0 | 0 |
| 796.0 | 0 |
| 795.0 | 0 |
| 794.0 | 0 |
| 793.0 | 0 |
| 792.0 | 0 |
| 791.0 | 0 |
| 790.0 | 0 |
| 789.0 | 0 |
| 788.0 | 0 |
| 787.0 | 0 |
| 786.0 | 0 |
| 785.0 | 0 |
| 784.0 | 0 |
| 783.0 | 0 |
| 782.0 | 0 |
| 781.0 | 0 |
| 780.0 | 0 |
| 779.0 | 0 |
| 778.0 | 0 |
| 777.0 | 0 |
| 776.0 | 0 |
| 775.0 | 0 |
| 774.0 | 0 |
| 773.0 | 0 |
| 772.0 | 0 |
| 771.0 | 0 |
| 770.0 | 0 |
| 769.0 | 0 |
| 768.0 | 0 |
| 767.0 | 0 |
| 766.0 | 0 |
| 765.0 | 0 |
| 764.0 | 0 |
| 763.0 | 0 |
| 762.0 | 0 |
| 761.0 | 0 |
| 760.0 | 0 |
| 759.0 | 0 |
| 758.0 | 0 |
| 757.0 | 0 |
| 756.0 | 0 |
| 755.0 | 0 |
| 754.0 | 0 |
| 753.0 | 0 |
| 752.0 | 0 |
| 751.0 | 0 |
| 750.0 | 0 |
| 749.0 | 0 |
| 748.0 | 0 |
| 747.0 | 0 |
| 746.0 | 0 |
| 745.0 | 0 |
| 744.0 | 0 |
| 743.0 | 0 |
| 742.0 | 0 |
| 741.0 | 0 |
| 740.0 | 0 |
| 739.0 | 0 |
| 738.0 | 0 |
| 737.0 | 0 |
| 736.0 | 0 |
| 735.0 | 0 |
| 734.0 | 0 |
| 733.0 | 0 |
| 732.0 | 0 |
| 731.0 | 0 |
| 730.0 | 0 |
| 729.0 | 0 |
| 728.0 | 0 |
| 727.0 | 0 |
| 726.0 | 0 |
| 725.0 | 0 |
| 724.0 | 0 |
| 723.0 | 0 |
| 722.0 | 0 |
| 721.0 | 0 |
| 720.0 | 0 |
| 719.0 | 0 |
| 718.0 | 0 |
| 717.0 | 0 |
| 716.0 | 0 |
| 715.0 | 0 |
| 714.0 | 0 |
| 713.0 | 0 |
| 712.0 | 0 |
| 711.0 | 0 |
| 710.0 | 0 |
| 709.0 | 0 |
| 708.0 | 0 |
| 707.0 | 0 |
| 706.0 | 0 |
| 705.0 | 0 |
| 704.0 | 0 |
| 703.0 | 0 |
| 702.0 | 0 |
| 701.0 | 0 |
| 700.0 | 0 |
| 699.0 | 0 |
| 698.0 | 0 |
| 697.0 | 0 |
| 696.0 | 0 |
| 695.0 | 0 |
| 694.0 | 0 |
| 693.0 | 0 |
| 692.0 | 0 |
| 691.0 | 0 |
| 690.0 | 0.001 |
| 689.0 | 0.001 |
| 688.0 | 0.001 |
| 687.0 | 0.001 |
| 686.0 | 0.001 |
| 685.0 | 0.001 |
| 684.0 | 0.001 |
| 683.0 | 0.001 |
| 682.0 | 0.002 |
| 681.0 | 0.002 |
| 680.0 | 0.002 |
| 679.0 | 0.003 |
| 678.0 | 0.003 |
| 677.0 | 0.004 |
| 676.0 | 0.005 |
| 675.0 | 0.006 |
| 674.0 | 0.008 |
| 673.0 | 0.01 |
| 672.0 | 0.013 |
| 671.0 | 0.017 |
| 670.0 | 0.023 |
| 669.0 | 0.031 |
| 668.0 | 0.044 |
| 667.0 | 0.062 |
| 666.0 | 0.091 |
| 665.0 | 0.137 |
| 664.0 | 0.215 |
| 663.0 | 0.348 |
| 662.0 | 0.597 |
| 661.0 | 1.083 |
| 660.0 | 2.105 |
| 659.0 | 4.375 |
| 658.0 | 7.802 |
| 657.0 | 19.332 |
| 656.0 | 32.931 |
| 655.0 | 45.006 |
| 654.0 | 51.221 |
| 653.0 | 53.202 |
| 652.0 | 54.525 |
| 651.0 | 56.098 |
| 650.0 | 57.414 |
| 649.0 | 57.842 |
| 648.0 | 56.542 |
| 647.0 | 51.056 |
| 646.0 | 39.681 |
| 645.0 | 24.963 |
| 644.0 | 12.892 |
| 643.0 | 6.023 |
| 642.0 | 2.768 |
| 641.0 | 1.373 |
| 640.0 | 0.705 |
| 639.0 | 0.396 |
| 638.0 | 0.232 |
| 637.0 | 0.145 |
| 636.0 | 0.093 |
| 635.0 | 0.062 |
| 634.0 | 0.042 |
| 633.0 | 0.029 |
| 632.0 | 0.021 |
| 631.0 | 0.015 |
| 630.0 | 0.011 |
| 629.0 | 0.009 |
| 628.0 | 0.007 |
| 627.0 | 0.005 |
| 626.0 | 0.004 |
| 625.0 | 0.003 |
| 624.0 | 0.003 |
| 623.0 | 0.002 |
| 622.0 | 0.002 |
| 621.0 | 0.001 |
| 620.0 | 0.001 |
| 619.0 | 0.001 |
| 618.0 | 0.001 |
| 617.0 | 0.001 |
| 616.0 | 0.001 |
| 615.0 | 0 |
| 614.0 | 0 |
| 613.0 | 0 |
| 612.0 | 0 |
| 611.0 | 0 |
| 610.0 | 0 |
| 609.0 | 0 |
| 608.0 | 0 |
| 607.0 | 0 |
| 606.0 | 0 |
| 605.0 | 0 |
| 604.0 | 0 |
| 603.0 | 0 |
| 602.0 | 0 |
| 601.0 | 0 |
| 600.0 | 0 |
| 599.0 | 0 |
| 598.0 | 0 |
| 597.0 | 0 |
| 596.0 | 0 |
| 595.0 | 0 |
| 594.0 | 0 |
| 593.0 | 0 |
| 592.0 | 0 |
| 591.0 | 0 |
| 590.0 | 0 |
| 589.0 | 0 |
| 588.0 | 0 |
| 587.0 | 0 |
| 586.0 | 0 |
| 585.0 | 0 |
| 584.0 | 0 |
| 583.0 | 0 |
| 582.0 | 0 |
| 581.0 | 0 |
| 580.0 | 0 |
| 579.0 | 0 |
| 578.0 | 0 |
| 577.0 | 0 |
| 576.0 | 0 |
| 575.0 | 0 |
| 574.0 | 0 |
| 573.0 | 0 |
| 572.0 | 0 |
| 571.0 | 0 |
| 570.0 | 0 |
| 569.0 | 0 |
| 568.0 | 0 |
| 567.0 | 0 |
| 566.0 | 0 |
| 565.0 | 0 |
| 564.0 | 0 |
| 563.0 | 0 |
| 562.0 | 0 |
| 561.0 | 0 |
| 560.0 | 0 |
| 559.0 | 0 |
| 558.0 | 0 |
| 557.0 | 0 |
| 556.0 | 0 |
| 555.0 | 0 |
| 554.0 | 0 |
| 553.0 | 0 |
| 552.0 | 0 |
| 551.0 | 0 |
| 550.0 | 0 |
| 549.0 | 0 |
| 548.0 | 0 |
| 547.0 | 0 |
| 546.0 | 0 |
| 545.0 | 0 |
| 544.0 | 0 |
| 543.0 | 0 |
| 542.0 | 0 |
| 541.0 | 0 |
| 540.0 | 0 |
| 539.0 | 0 |
| 538.0 | 0 |
| 537.0 | 0 |
| 536.0 | 0 |
| 535.0 | 0 |
| 534.0 | 0 |
| 533.0 | 0 |
| 532.0 | 0 |
| 531.0 | 0 |
| 530.0 | 0 |
| 529.0 | 0 |
| 528.0 | 0 |
| 527.0 | 0 |
| 526.0 | 0 |
| 525.0 | 0 |
| 524.0 | 0 |
| 523.0 | 0 |
| 522.0 | 0 |
| 521.0 | 0 |
| 520.0 | 0 |
| 519.0 | 0 |
| 518.0 | 0 |
| 517.0 | 0 |
| 516.0 | 0 |
| 515.0 | 0 |
| 514.0 | 0 |
| 513.0 | 0 |
| 512.0 | 0 |
| 511.0 | 0 |
| 510.0 | 0 |
| 509.0 | 0 |
| 508.0 | 0 |
| 507.0 | 0 |
| 506.0 | 0 |
| 505.0 | 0 |
| 504.0 | 0 |
| 503.0 | 0 |
| 502.0 | 0 |
| 501.0 | 0 |
| 500.0 | 0 |
| 499.0 | 0 |
| 498.0 | 0 |
| 497.0 | 0 |
| 496.0 | 0 |
| 495.0 | 0 |
| 494.0 | 0 |
| 493.0 | 0 |
| 492.0 | 0 |
| 491.0 | 0 |
| 490.0 | 0 |
| 489.0 | 0 |
| 488.0 | 0 |
| 487.0 | 0 |
| 486.0 | 0 |
| 485.0 | 0 |
| 484.0 | 0 |
| 483.0 | 0 |
| 482.0 | 0 |
| 481.0 | 0 |
| 480.0 | 0 |
| 479.0 | 0 |
| 478.0 | 0 |
| 477.0 | 0 |
| 476.0 | 0 |
| 475.0 | 0 |
| 474.0 | 0 |
| 473.0 | 0 |
| 472.0 | 0 |
| 471.0 | 0 |
| 470.0 | 0 |
| 469.0 | 0 |
| 468.0 | 0 |
| 467.0 | 0 |
| 466.0 | 0 |
| 465.0 | 0 |
| 464.0 | 0 |
| 463.0 | 0 |
| 462.0 | 0 |
| 461.0 | 0 |
| 460.0 | 0 |
| 459.0 | 0 |
| 458.0 | 0 |
| 457.0 | 0 |
| 456.0 | 0 |
| 455.0 | 0 |
| 454.0 | 0 |
| 453.0 | 0 |
| 452.0 | 0 |
| 451.0 | 0 |
| 450.0 | 0 |
| 449.0 | 0 |
| 448.0 | 0 |
| 447.0 | 0 |
| 446.0 | 0 |
| 445.0 | 0 |
| 444.0 | 0 |
| 443.0 | 0 |
| 442.0 | 0 |
| 441.0 | 0 |
| 440.0 | 0 |
| 439.0 | 0 |
| 438.0 | 0 |
| 437.0 | 0 |
| 436.0 | 0 |
| 435.0 | 0 |
| 434.0 | 0 |
| 433.0 | 0 |
| 432.0 | 0 |
| 431.0 | 0 |
| 430.0 | 0 |
| 429.0 | 0 |
| 428.0 | 0 |
| 427.0 | 0 |
| 426.0 | 0 |
| 425.0 | 0 |
| 424.0 | 0 |
| 423.0 | 0 |
| 422.0 | 0 |
| 421.0 | 0 |
| 420.0 | 0 |
| 419.0 | 0 |
| 418.0 | 0 |
| 417.0 | 0 |
| 416.0 | 0 |
| 415.0 | 0 |
| 414.0 | 0 |
| 413.0 | 0 |
| 412.0 | 0 |
| 411.0 | 0 |
| 410.0 | 0 |
| 409.0 | 0 |
| 408.0 | 0 |
| 407.0 | 0 |
| 406.0 | 0 |
| 405.0 | 0 |
| 404.0 | 0 |
| 403.0 | 0 |
| 402.0 | 0 |
| 401.0 | 0 |
| 400.0 | 0 |
| 399.0 | 0 |
| 398.0 | 0 |
| 397.0 | 0 |
| 396.0 | 0 |
| 395.0 | 0 |
| 394.0 | 0 |
| 393.0 | 0 |
| 392.0 | 0 |
| 391.0 | 0 |
| 390.0 | 0 |
| 389.0 | 0 |
| 388.0 | 0 |
| 387.0 | 0 |
| 386.0 | 0 |
| 385.0 | 0 |
| 384.0 | 0 |
| 383.0 | 0 |
| 382.0 | 0 |
| 381.0 | 0 |
| 380.0 | 0 |
| 379.0 | 0 |
| 378.0 | 0 |
| 377.0 | 0 |
| 376.0 | 0 |
| 375.0 | 0 |
| 374.0 | 0 |
| 373.0 | 0 |
| 372.0 | 0 |
| 371.0 | 0 |
| 370.0 | 0 |
| 369.0 | 0 |
| 368.0 | 0 |
| 367.0 | 0 |
| 366.0 | 0 |
| 365.0 | 0 |
| 364.0 | 0 |
| 363.0 | 0 |
| 362.0 | 0 |
| 361.0 | 0 |
| 360.0 | 0 |
| 359.0 | 0 |
| 358.0 | 0 |
| 357.0 | 0 |
| 356.0 | 0 |
| 355.0 | 0 |
| 354.0 | 0 |
| 353.0 | 0 |
| 352.0 | 0 |
| 351.0 | 0 |
| 350.0 | 0 |
| 349.0 | 0 |
| 348.0 | 0 |
| 347.0 | 0 |
| 346.0 | 0 |
| 345.0 | 0 |
| 344.0 | 0 |
| 343.0 | 0 |
| 342.0 | 0 |
| 341.0 | 0 |
| 340.0 | 0 |
| 339.0 | 0 |
| 338.0 | 0 |
| 337.0 | 0 |
| 336.0 | 0 |
| 335.0 | 0 |
| 334.0 | 0 |
| 333.0 | 0 |
| 332.0 | 0 |
| 331.0 | 0 |
| 330.0 | 0 |
| 329.0 | 0 |
| 328.0 | 0 |
| 327.0 | 0 |
| 326.0 | 0 |
| 325.0 | 0 |
| 324.0 | 0 |
| 323.0 | 0 |
| 322.0 | 0 |
| 321.0 | 0 |
| 320.0 | 0 |
| 319.0 | 0 |
| 318.0 | 0 |
| 317.0 | 0 |
| 316.0 | 0 |
| 315.0 | 0 |
| 314.0 | 0 |
| 313.0 | 0 |
| 312.0 | 0 |
| 311.0 | 0 |
| 310.0 | 0 |
| 309.0 | 0 |
| 308.0 | 0 |
| 307.0 | 0 |
| 306.0 | 0 |
| 305.0 | 0 |
| 304.0 | 0 |
| 303.0 | 0 |
| 302.0 | 0 |
| 301.0 | 0 |
| 300.0 | 0 |
| 299.0 | 0 |
| 298.0 | 0 |
| 297.0 | 0 |
| 296.0 | 0 |
| 295.0 | 0 |
| 294.0 | 0 |
| 293.0 | 0 |
| 292.0 | 0 |
| 291.0 | 0 |
| 290.0 | 0 |
| 289.0 | 0 |
| 288.0 | 0 |
| 287.0 | 0 |
| 286.0 | 0 |
| 285.0 | 0 |
| 284.0 | 0 |
| 283.0 | 0 |
| 282.0 | 0 |
| 281.0 | 0 |
| 280.0 | 0 |
| 279.0 | 0 |
| 278.0 | 0 |
| 277.0 | 0 |
| 276.0 | 0 |
| 275.0 | 0 |
| 274.0 | 0 |
| 273.0 | 0 |
| 272.0 | 0 |
| 271.0 | 0 |
| 270.0 | 0 |
| 269.0 | 0 |
| 268.0 | 0 |
| 267.0 | 0 |
| 266.0 | 0 |
| 265.0 | 0 |
| 264.0 | 0 |
| 263.0 | 0 |
| 262.0 | 0 |
| 261.0 | 0 |
| 260.0 | 0 |
| 259.0 | 0 |
| 258.0 | 0 |
| 257.0 | 0 |
| 256.0 | 0 |
| 255.0 | 0 |
| 254.0 | 0 |
| 253.0 | 0 |
| 252.0 | 0 |
| 251.0 | 0 |
| 250.0 | 0 |
| 249.0 | 0 |
| 248.0 | 0 |
| 247.0 | 0 |
| 246.0 | 0 |
| 245.0 | 0 |
| 244.0 | 0 |
| 243.0 | 0 |
| 242.0 | 0 |
| 241.0 | 0 |
| 240.0 | 0 |
| 239.0 | 0 |
| 238.0 | 0 |
| 237.0 | 0 |
| 236.0 | 0 |
| 235.0 | 0 |
| 234.0 | 0 |
| 233.0 | 0 |
| 232.0 | 0 |
| 231.0 | 0 |
| 230.0 | 0 |
| 229.0 | 0 |
| 228.0 | 0 |
| 227.0 | 0 |
| 226.0 | 0 |
| 225.0 | 0 |
| 224.0 | 0 |
| 223.0 | 0 |
| 222.0 | 0 |
| 221.0 | 0 |
| 220.0 | 0 |
| 219.0 | 0 |
| 218.0 | 0 |
| 217.0 | 0 |
| 216.0 | 0 |
| 215.0 | 0 |
| 214.0 | 0 |
| 213.0 | 0 |
| 212.0 | 0 |
| 211.0 | 0 |
| 210.0 | 0 |
| 209.0 | 0 |
| 208.0 | 0 |
| 207.0 | 0 |
| 206.0 | 0 |
| 205.0 | 0 |
| 204.0 | 0 |
| 203.0 | 0 |
| 202.0 | 0 |
| 201.0 | 0 |